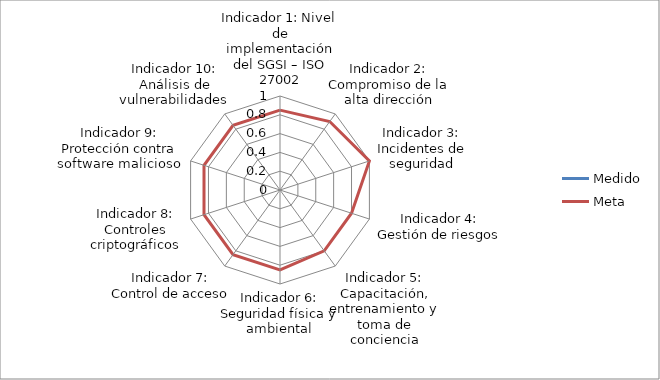
| Category | Medido | Meta |
|---|---|---|
| Indicador 1: Nivel de implementación del SGSI – ISO 27002 | 0 | 0.85 |
| Indicador 2: Compromiso de la alta dirección | 0 | 0.9 |
| Indicador 3: Incidentes de seguridad | 0 | 1 |
| Indicador 4: Gestión de riesgos | 0 | 0.8 |
| Indicador 5: Capacitación, entrenamiento y toma de conciencia | 0 | 0.8 |
| Indicador 6: Seguridad física y ambiental | 0 | 0.85 |
| Indicador 7: Control de acceso | 0 | 0.85 |
| Indicador 8: Controles criptográficos | 0 | 0.85 |
| Indicador 9: Protección contra software malicioso | 0 | 0.85 |
| Indicador 10: Análisis de vulnerabilidades | 0 | 0.85 |